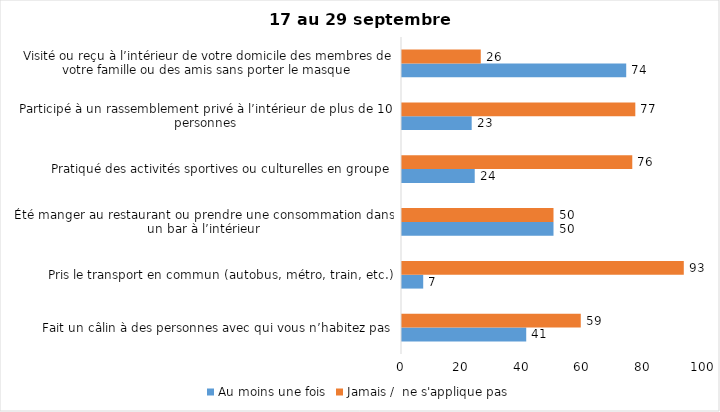
| Category | Au moins une fois | Jamais /  ne s'applique pas |
|---|---|---|
| Fait un câlin à des personnes avec qui vous n’habitez pas | 41 | 59 |
| Pris le transport en commun (autobus, métro, train, etc.) | 7 | 93 |
| Été manger au restaurant ou prendre une consommation dans un bar à l’intérieur | 50 | 50 |
| Pratiqué des activités sportives ou culturelles en groupe | 24 | 76 |
| Participé à un rassemblement privé à l’intérieur de plus de 10 personnes | 23 | 77 |
| Visité ou reçu à l’intérieur de votre domicile des membres de votre famille ou des amis sans porter le masque | 74 | 26 |